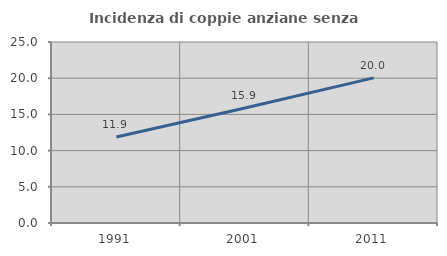
| Category | Incidenza di coppie anziane senza figli  |
|---|---|
| 1991.0 | 11.89 |
| 2001.0 | 15.89 |
| 2011.0 | 20.048 |